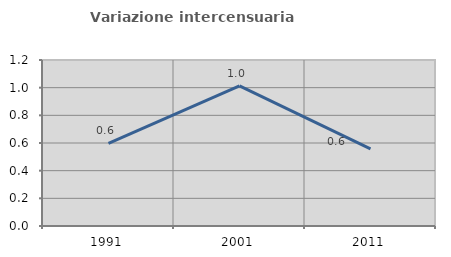
| Category | Variazione intercensuaria annua |
|---|---|
| 1991.0 | 0.597 |
| 2001.0 | 1.013 |
| 2011.0 | 0.558 |